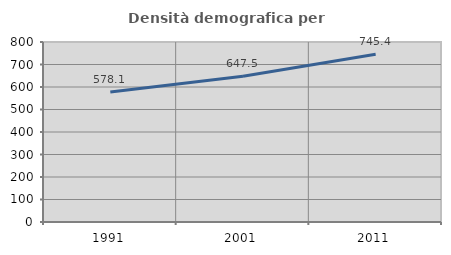
| Category | Densità demografica |
|---|---|
| 1991.0 | 578.118 |
| 2001.0 | 647.539 |
| 2011.0 | 745.374 |